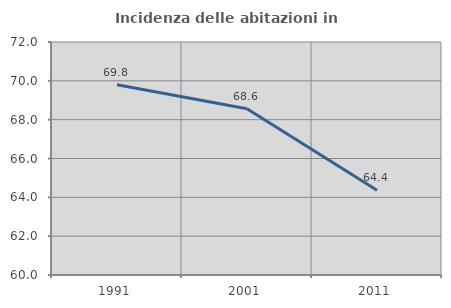
| Category | Incidenza delle abitazioni in proprietà  |
|---|---|
| 1991.0 | 69.795 |
| 2001.0 | 68.563 |
| 2011.0 | 64.37 |